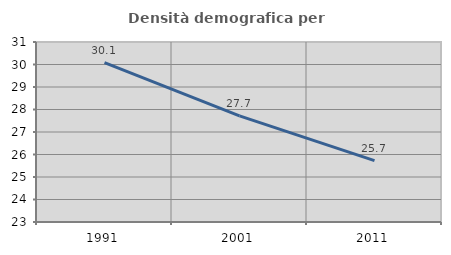
| Category | Densità demografica |
|---|---|
| 1991.0 | 30.084 |
| 2001.0 | 27.714 |
| 2011.0 | 25.725 |